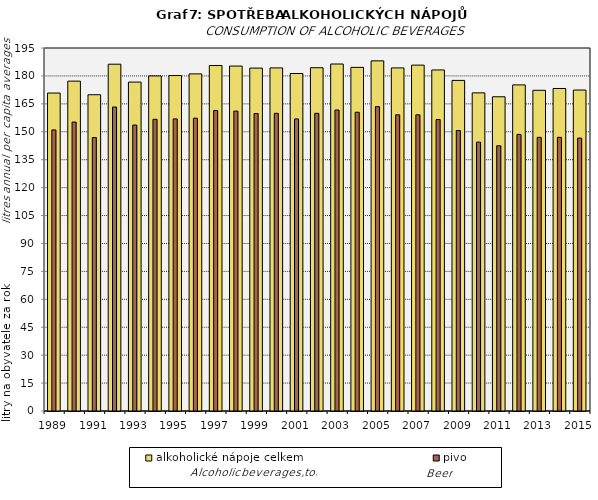
| Category | alkoholické nápoje celkem |
|---|---|
| 1989.0 | 170.8 |
| 1990.0 | 177.2 |
| 1991.0 | 169.9 |
| 1992.0 | 186.3 |
| 1993.0 | 176.7 |
| 1994.0 | 180 |
| 1995.0 | 180.2 |
| 1996.0 | 181.1 |
| 1997.0 | 185.6 |
| 1998.0 | 185.3 |
| 1999.0 | 184.2 |
| 2000.0 | 184.3 |
| 2001.0 | 181.3 |
| 2002.0 | 184.4 |
| 2003.0 | 186.4 |
| 2004.0 | 184.6 |
| 2005.0 | 188.1 |
| 2006.0 | 184.3 |
| 2007.0 | 185.8 |
| 2008.0 | 183.2 |
| 2009.0 | 177.6 |
| 2010.0 | 170.9 |
| 2011.0 | 168.8 |
| 2012.0 | 175.18 |
| 2013.0 | 172.28 |
| 2014.0 | 173.25 |
| 2015.0 | 172.42 |